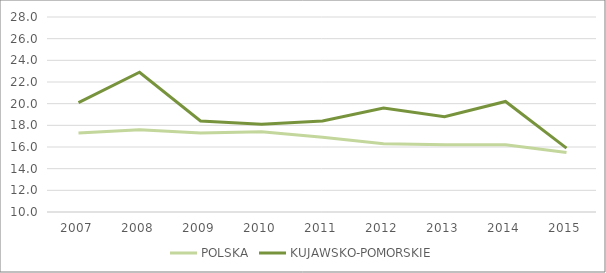
| Category | POLSKA | KUJAWSKO-POMORSKIE |
|---|---|---|
| 2007 | 17.3 | 20.1 |
| 2008 | 17.6 | 22.9 |
| 2009 | 17.3 | 18.4 |
| 2010 | 17.4 | 18.1 |
| 2011 | 16.9 | 18.4 |
| 2012 | 16.3 | 19.6 |
| 2013 | 16.2 | 18.8 |
| 2014 | 16.2 | 20.2 |
| 2015 | 15.5 | 15.9 |